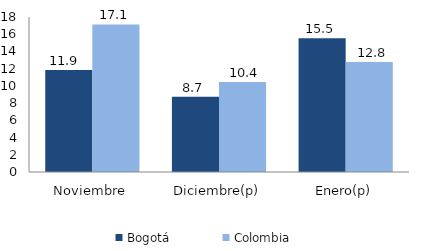
| Category | Bogotá | Colombia |
|---|---|---|
| Noviembre | 11.85 | 17.136 |
| Diciembre(p) | 8.737 | 10.447 |
| Enero(p) | 15.526 | 12.77 |